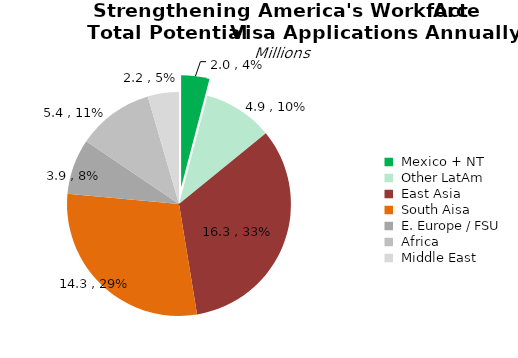
| Category | H1 Class Visas Issued |
|---|---|
|  Mexico + NT  | 1.999 |
|  Other LatAm  | 4.934 |
|  East Asia  | 16.335 |
|  South Aisa  | 14.254 |
|  E. Europe / FSU  | 3.927 |
|  Africa  | 5.41 |
|  Middle East  | 2.209 |